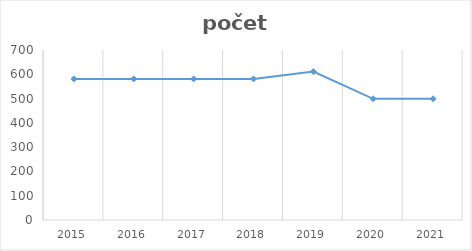
| Category | počet lôžok |
|---|---|
| 2015.0 | 581 |
| 2016.0 | 581 |
| 2017.0 | 581 |
| 2018.0 | 581 |
| 2019.0 | 611 |
| 2020.0 | 499 |
| 2021.0 | 499 |